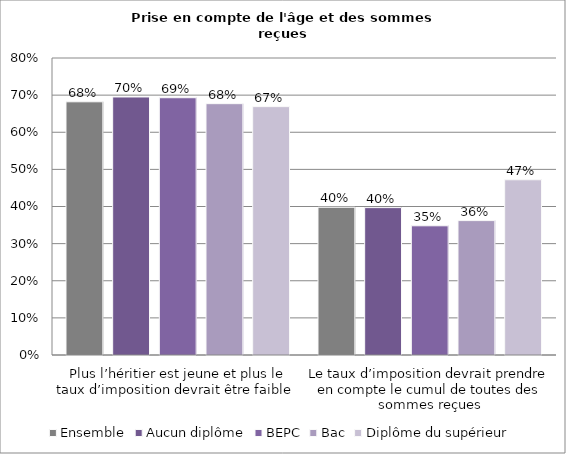
| Category | Ensemble | Aucun diplôme | BEPC | Bac | Diplôme du supérieur |
|---|---|---|---|---|---|
| Plus l’héritier est jeune et plus le taux d’imposition devrait être faible  | 0.682 | 0.695 | 0.693 | 0.677 | 0.669 |
| Le taux d’imposition devrait prendre en compte le cumul de toutes des sommes reçues | 0.398 | 0.397 | 0.348 | 0.362 | 0.472 |